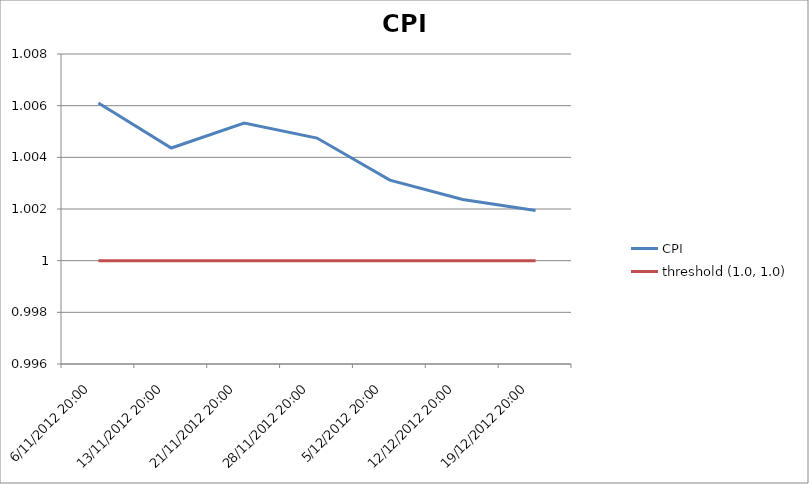
| Category | CPI | threshold (1.0, 1.0) |
|---|---|---|
| 6/11/2012 20:00 | 1.006 | 1 |
| 13/11/2012 20:00 | 1.004 | 1 |
| 21/11/2012 20:00 | 1.005 | 1 |
| 28/11/2012 20:00 | 1.005 | 1 |
| 5/12/2012 20:00 | 1.003 | 1 |
| 12/12/2012 20:00 | 1.002 | 1 |
| 19/12/2012 20:00 | 1.002 | 1 |